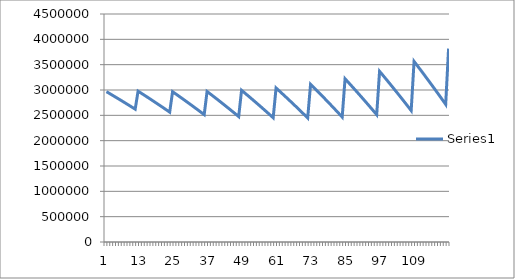
| Category | Series 0 |
|---|---|
| 0 | 2966863 |
| 1 | 2933477.472 |
| 2 | 2899841.554 |
| 3 | 2865953.365 |
| 4 | 2831811.015 |
| 5 | 2797412.598 |
| 6 | 2762756.193 |
| 7 | 2727839.864 |
| 8 | 2692661.663 |
| 9 | 2657219.625 |
| 10 | 2621511.773 |
| 11 | 2977036.111 |
| 12 | 2940790.632 |
| 13 | 2904273.311 |
| 14 | 2867482.111 |
| 15 | 2830414.977 |
| 16 | 2793069.839 |
| 17 | 2755444.613 |
| 18 | 2717537.198 |
| 19 | 2679345.477 |
| 20 | 2640867.318 |
| 21 | 2602100.573 |
| 22 | 2563043.077 |
| 23 | 2966283.4 |
| 24 | 2926637.845 |
| 25 | 2886694.948 |
| 26 | 2846452.48 |
| 27 | 2805908.193 |
| 28 | 2765059.824 |
| 29 | 2723905.092 |
| 30 | 2682441.699 |
| 31 | 2640667.331 |
| 32 | 2598579.656 |
| 33 | 2556176.322 |
| 34 | 2513454.964 |
| 35 | 2970762.039 |
| 36 | 2927397.457 |
| 37 | 2883707.641 |
| 38 | 2839690.151 |
| 39 | 2795342.531 |
| 40 | 2750662.303 |
| 41 | 2705646.973 |
| 42 | 2660294.028 |
| 43 | 2614600.937 |
| 44 | 2568565.147 |
| 45 | 2522184.088 |
| 46 | 2475455.172 |
| 47 | 2994020.156 |
| 48 | 2946587.677 |
| 49 | 2898799.455 |
| 50 | 2850652.821 |
| 51 | 2802145.088 |
| 52 | 2753273.546 |
| 53 | 2704035.468 |
| 54 | 2654428.104 |
| 55 | 2604448.686 |
| 56 | 2554094.421 |
| 57 | 2503362.499 |
| 58 | 2452250.088 |
| 59 | 3040215.291 |
| 60 | 2988333.319 |
| 61 | 2936062.232 |
| 62 | 2883399.112 |
| 63 | 2830341.018 |
| 64 | 2776884.989 |
| 65 | 2723028.04 |
| 66 | 2668767.163 |
| 67 | 2614099.33 |
| 68 | 2559021.488 |
| 69 | 2503530.562 |
| 70 | 2447623.455 |
| 71 | 3114207.655 |
| 72 | 3057458.796 |
| 73 | 3000284.321 |
| 74 | 2942681.037 |
| 75 | 2884645.728 |
| 76 | 2826175.155 |
| 77 | 2767266.052 |
| 78 | 2707915.131 |
| 79 | 2648119.078 |
| 80 | 2587874.554 |
| 81 | 2527178.197 |
| 82 | 2466026.617 |
| 83 | 3221666.847 |
| 84 | 3159594.553 |
| 85 | 3097056.717 |
| 86 | 3034049.848 |
| 87 | 2970570.427 |
| 88 | 2906614.91 |
| 89 | 2842179.728 |
| 90 | 2777261.281 |
| 91 | 2711855.945 |
| 92 | 2645960.07 |
| 93 | 2579569.976 |
| 94 | 2512681.956 |
| 95 | 3369193.905 |
| 96 | 3301298.803 |
| 97 | 3232894.487 |
| 98 | 3163977.138 |
| 99 | 3094542.91 |
| 100 | 3024587.925 |
| 101 | 2954108.277 |
| 102 | 2883100.032 |
| 103 | 2811559.225 |
| 104 | 2739481.862 |
| 105 | 2666863.919 |
| 106 | 2593701.342 |
| 107 | 3564460.837 |
| 108 | 3490196.705 |
| 109 | 3415375.593 |
| 110 | 3339993.322 |
| 111 | 3264045.684 |
| 112 | 3187528.438 |
| 113 | 3110437.314 |
| 114 | 3032768.006 |
| 115 | 2954516.178 |
| 116 | 2875677.461 |
| 117 | 2796247.454 |
| 118 | 2716221.722 |
| 119 | 3816370.028 |